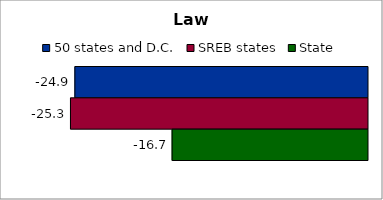
| Category | 50 states and D.C. | SREB states | State |
|---|---|---|---|
| 0 | -24.939 | -25.314 | -16.653 |